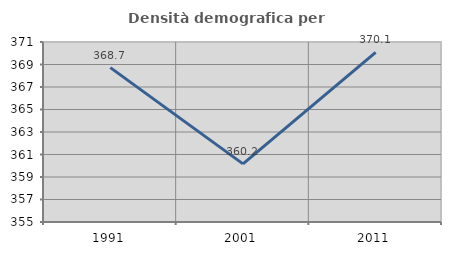
| Category | Densità demografica |
|---|---|
| 1991.0 | 368.725 |
| 2001.0 | 360.167 |
| 2011.0 | 370.075 |